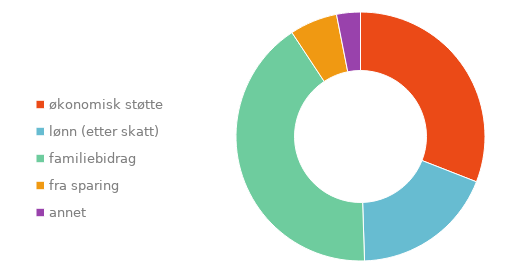
| Category | Series 0 |
|---|---|
| økonomisk støtte | 0.309 |
| lønn (etter skatt) | 0.186 |
| familiebidrag | 0.412 |
| fra sparing | 0.062 |
| annet | 0.031 |